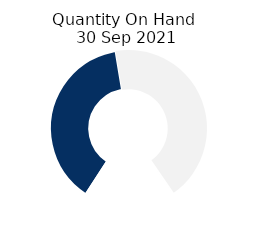
| Category | Quantity On Hand 
30 Sep 2021 |
|---|---|
| 0 | 61.127 |
| 1 | 68.873 |
| 2 | 30 |